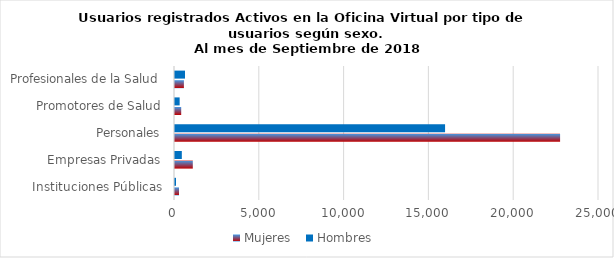
| Category | Mujeres | Hombres |
|---|---|---|
| Instituciones Públicas | 235 | 59 |
| Empresas Privadas | 1050 | 402 |
| Personales | 22706 | 15924 |
| Promotores de Salud | 366 | 274 |
| Profesionales de la Salud | 525 | 589 |